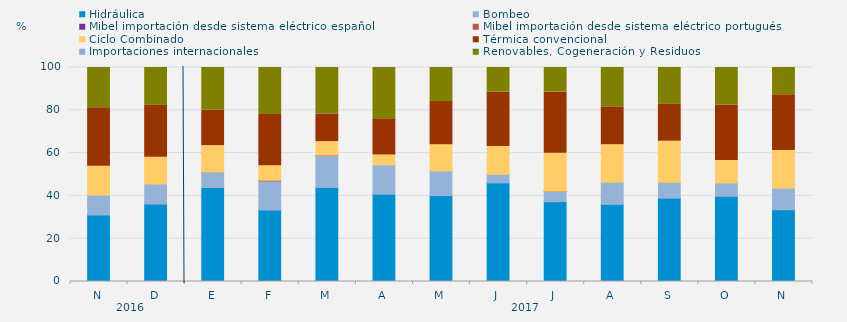
| Category | Hidráulica | Bombeo | Mibel importación desde sistema eléctrico español | Mibel importación desde sistema eléctrico portugués | Ciclo Combinado | Térmica convencional | Importaciones internacionales | Renovables, Cogeneración y Residuos |
|---|---|---|---|---|---|---|---|---|
| N | 31.088 | 9.259 | 0 | 0 | 13.495 | 27.361 | 0 | 18.796 |
| D | 36.178 | 9.409 | 0 | 0 | 12.522 | 24.194 | 0 | 17.697 |
| E | 43.929 | 7.303 | 0 | 0 | 12.254 | 16.51 | 0 | 20.004 |
| F | 33.383 | 13.641 | 0 | 0.298 | 6.82 | 23.884 | 0 | 21.974 |
| M | 43.966 | 14.984 | 0 | 0.135 | 6.303 | 12.943 | 0 | 21.669 |
| A | 40.799 | 13.738 | 0 | 0 | 4.583 | 16.933 | 0 | 23.947 |
| M | 40.143 | 11.559 | 0 | 0 | 12.186 | 20.228 | 0 | 15.883 |
| J | 46.088 | 3.981 | 0 | 0 | 13.032 | 25.463 | 0 | 11.435 |
| J | 37.298 | 4.783 | 0 | 0.134 | 17.675 | 28.595 | 0 | 11.514 |
| A | 36.044 | 10.361 | 0 | 0 | 17.518 | 17.708 | 0 | 18.369 |
| S | 38.947 | 7.407 | 0 | 0 | 19.201 | 17.187 | 0 | 17.257 |
| O | 39.807 | 6.25 | 0 | 0 | 10.484 | 25.963 | 0 | 17.496 |
| N | 33.519 | 10.116 | 0 | 0 | 17.546 | 26.088 | 0 | 12.731 |